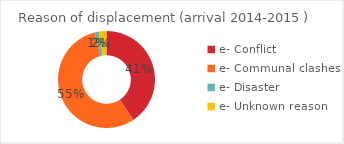
| Category | Series 0 |
|---|---|
| e- Conflict | 77815 |
| e- Communal clashes | 105808 |
| e- Disaster | 2714 |
| e- Unknown reason | 4767 |